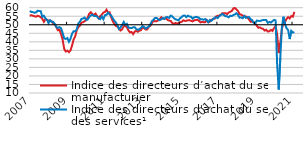
| Category | Indice des directeurs d’achat du secteur manufacturier | Indice des directeurs d'achat du secteur des services¹ |
|---|---|---|
| 2007-01-15 | 55.308 | 58.122 |
| 2007-02-15 | 55.617 | 57.487 |
| 2007-03-15 | 55.282 | 57.397 |
| 2007-04-15 | 54.974 | 57.041 |
| 2007-05-15 | 54.74 | 57.244 |
| 2007-06-15 | 55.291 | 58.217 |
| 2007-07-15 | 54.943 | 58.087 |
| 2007-08-15 | 54.469 | 57.945 |
| 2007-09-15 | 53.461 | 54.697 |
| 2007-10-15 | 51.746 | 55.285 |
| 2007-11-15 | 53.343 | 53.718 |
| 2007-12-15 | 52.792 | 52.989 |
| 2008-01-15 | 52.557 | 50.924 |
| 2008-02-15 | 52.258 | 52.627 |
| 2008-03-15 | 51.998 | 51.712 |
| 2008-04-15 | 50.619 | 51.663 |
| 2008-05-15 | 50.214 | 50.436 |
| 2008-06-15 | 48.492 | 48.743 |
| 2008-07-15 | 46.748 | 48.148 |
| 2008-08-15 | 47.071 | 48.594 |
| 2008-09-15 | 44.391 | 47.961 |
| 2008-10-15 | 41.172 | 45.104 |
| 2008-11-15 | 35.811 | 42.001 |
| 2008-12-15 | 34.316 | 41.703 |
| 2009-01-15 | 34.784 | 42.222 |
| 2009-02-15 | 33.905 | 40.014 |
| 2009-03-15 | 34.971 | 41.838 |
| 2009-04-15 | 37.86 | 44.774 |
| 2009-05-15 | 41.361 | 46.212 |
| 2009-06-15 | 43.26 | 46.085 |
| 2009-07-15 | 46.796 | 47.272 |
| 2009-08-15 | 48.653 | 50.801 |
| 2009-09-15 | 49.438 | 51.757 |
| 2009-10-15 | 51.223 | 53.397 |
| 2009-11-15 | 51.504 | 53.667 |
| 2009-12-15 | 52.043 | 54.19 |
| 2010-01-15 | 52.678 | 52.855 |
| 2010-02-15 | 54.3 | 53.147 |
| 2010-03-15 | 56.506 | 54.59 |
| 2010-04-15 | 57.36 | 55.46 |
| 2010-05-15 | 56.092 | 55.9 |
| 2010-06-15 | 55.886 | 55.178 |
| 2010-07-15 | 56.587 | 55.116 |
| 2010-08-15 | 55.101 | 54.81 |
| 2010-09-15 | 53.774 | 53.731 |
| 2010-10-15 | 55.109 | 53.284 |
| 2010-11-15 | 55.869 | 54.895 |
| 2010-12-15 | 57.172 | 53.243 |
| 2011-01-15 | 57.472 | 55.617 |
| 2011-02-15 | 58.843 | 55.802 |
| 2011-03-15 | 57.178 | 57.093 |
| 2011-04-15 | 57.307 | 56.099 |
| 2011-05-15 | 54.338 | 55.413 |
| 2011-06-15 | 52.066 | 53.74 |
| 2011-07-15 | 50.491 | 52.375 |
| 2011-08-15 | 49.315 | 51.306 |
| 2011-09-15 | 48.977 | 49.672 |
| 2011-10-15 | 47.631 | 47.512 |
| 2011-11-15 | 46.648 | 48.451 |
| 2011-12-15 | 47.336 | 49.92 |
| 2012-01-15 | 49.173 | 51.656 |
| 2012-02-15 | 49.288 | 49.914 |
| 2012-03-15 | 48.529 | 50.536 |
| 2012-04-15 | 46.705 | 48.326 |
| 2012-05-15 | 45.526 | 48.165 |
| 2012-06-15 | 45.774 | 48.043 |
| 2012-07-15 | 44.528 | 48.555 |
| 2012-08-15 | 45.974 | 48.603 |
| 2012-09-15 | 46.515 | 47.49 |
| 2012-10-15 | 45.88 | 47.038 |
| 2012-11-15 | 46.528 | 47.503 |
| 2012-12-15 | 46.814 | 48.123 |
| 2013-01-15 | 48.326 | 49.26 |
| 2013-02-15 | 48.018 | 48.759 |
| 2013-03-15 | 47.226 | 47.716 |
| 2013-04-15 | 47.287 | 48.344 |
| 2013-05-15 | 48.821 | 48.954 |
| 2013-06-15 | 49.398 | 50.209 |
| 2013-07-15 | 50.929 | 52.118 |
| 2013-08-15 | 52.429 | 52.895 |
| 2013-09-15 | 51.986 | 54.013 |
| 2013-10-15 | 52.054 | 54.007 |
| 2013-11-15 | 52.594 | 53.163 |
| 2013-12-15 | 53.285 | 52.722 |
| 2014-01-15 | 54.388 | 53.189 |
| 2014-02-15 | 53.753 | 53.928 |
| 2014-03-15 | 53.369 | 53.467 |
| 2014-04-15 | 53.937 | 54.456 |
| 2014-05-15 | 52.819 | 54.507 |
| 2014-06-15 | 52.474 | 53.992 |
| 2014-07-15 | 52.226 | 55.354 |
| 2014-08-15 | 51.02 | 54.889 |
| 2014-09-15 | 50.569 | 53.876 |
| 2014-10-15 | 50.985 | 53.223 |
| 2014-11-15 | 50.756 | 52.92 |
| 2014-12-15 | 50.932 | 52.616 |
| 2015-01-15 | 51.468 | 53.825 |
| 2015-02-15 | 51.751 | 54.472 |
| 2015-03-15 | 52.627 | 55.338 |
| 2015-04-15 | 52.244 | 55.397 |
| 2015-05-15 | 52.323 | 54.428 |
| 2015-06-15 | 52.636 | 55.376 |
| 2015-07-15 | 52.641 | 54.798 |
| 2015-08-15 | 52.291 | 54.72 |
| 2015-09-15 | 51.969 | 53.585 |
| 2015-10-15 | 52.577 | 54.287 |
| 2015-11-15 | 52.761 | 54.636 |
| 2015-12-15 | 52.919 | 54.501 |
| 2016-01-15 | 52.369 | 54.12 |
| 2016-02-15 | 51.385 | 53.16 |
| 2016-03-15 | 51.692 | 53.259 |
| 2016-04-15 | 51.507 | 52.92 |
| 2016-05-15 | 51.429 | 53.354 |
| 2016-06-15 | 52.763 | 52.655 |
| 2016-07-15 | 51.432 | 51.514 |
| 2016-08-15 | 51.845 | 52.827 |
| 2016-09-15 | 52.885 | 52.307 |
| 2016-10-15 | 53.383 | 53.267 |
| 2016-11-15 | 53.487 | 54.129 |
| 2016-12-15 | 54.895 | 54.365 |
| 2017-01-15 | 55.242 | 53.906 |
| 2017-02-15 | 55.359 | 54.996 |
| 2017-03-15 | 55.923 | 55.742 |
| 2017-04-15 | 56.735 | 56.29 |
| 2017-05-15 | 56.766 | 55.683 |
| 2017-06-15 | 56.814 | 54.977 |
| 2017-07-15 | 56.251 | 54.997 |
| 2017-08-15 | 57.105 | 54.369 |
| 2017-09-15 | 57.633 | 55.269 |
| 2017-10-15 | 58.09 | 55.134 |
| 2017-11-15 | 59.58 | 55.677 |
| 2017-12-15 | 59.814 | 56.08 |
| 2018-01-15 | 58.928 | 56.797 |
| 2018-02-15 | 58.051 | 55.794 |
| 2018-03-15 | 56.272 | 54.166 |
| 2018-04-15 | 55.915 | 54.291 |
| 2018-05-15 | 55.343 | 53.823 |
| 2018-06-15 | 54.871 | 55.149 |
| 2018-07-15 | 54.868 | 54.055 |
| 2018-08-15 | 54.256 | 54.374 |
| 2018-09-15 | 53.11 | 54.491 |
| 2018-10-15 | 51.826 | 53.368 |
| 2018-11-15 | 51.828 | 52.728 |
| 2018-12-15 | 51.468 | 51.171 |
| 2019-01-15 | 50.556 | 50.903 |
| 2019-02-15 | 49.469 | 52.451 |
| 2019-03-15 | 48.27 | 52.291 |
| 2019-04-15 | 48.425 | 52.24 |
| 2019-05-15 | 47.892 | 52.48 |
| 2019-06-15 | 47.63 | 52.818 |
| 2019-07-15 | 46.593 | 52.782 |
| 2019-08-15 | 47.084 | 52.794 |
| 2019-09-15 | 46.026 | 51.131 |
| 2019-10-15 | 46.211 | 51.662 |
| 2019-11-15 | 47.011 | 51.241 |
| 2019-12-15 | 46.39 | 52.116 |
| 2020-01-15 | 48.061 | 52.838 |
| 2020-02-15 | 49.11 | 52.606 |
| 2020-03-15 | 44.26 | 26.421 |
| 2020-04-15 | 33.401 | 12.014 |
| 2020-05-15 | 39.513 | 30.489 |
| 2020-06-15 | 47.358 | 48.284 |
| 2020-07-15 | 51.731 | 54.695 |
| 2020-08-15 | 51.587 | 50.462 |
| 2020-09-15 | 53.481 | 48.002 |
| 2020-10-15 | 54.476 | 46.891 |
| 2020-11-15 | 53.69 | 41.658 |
| 2020-12-15 | 55.079 | 46.415 |
| 2021-01-15 | 54.717 | 45.416 |
| 2021-02-15 | 57.581 | 45.694 |